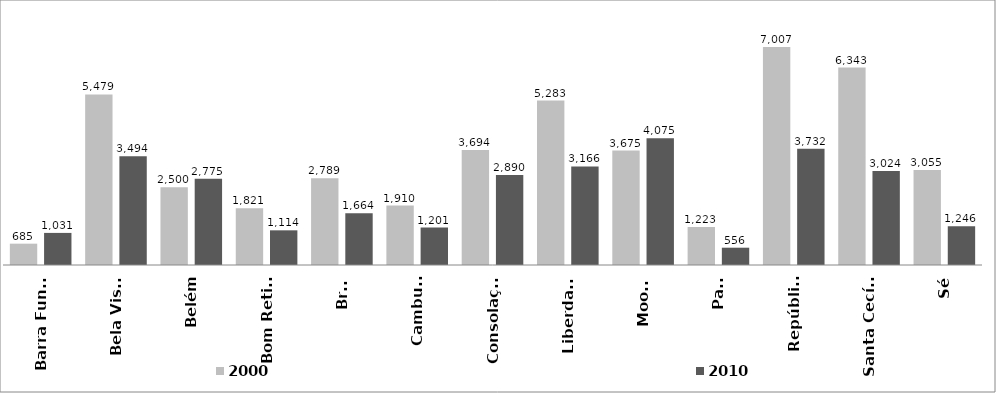
| Category | 2000 | 2010 |
|---|---|---|
| Barra Funda | 685 | 1031 |
| Bela Vista | 5479 | 3494 |
| Belém | 2500 | 2775 |
| Bom Retiro | 1821 | 1114 |
| Brás | 2789 | 1664 |
| Cambuci | 1910 | 1201 |
| Consolação | 3694 | 2890 |
| Liberdade | 5283 | 3166 |
| Mooca | 3675 | 4075 |
| Pari | 1223 | 556 |
| República | 7007 | 3732 |
| Santa Cecília | 6343 | 3024 |
| Sé | 3055 | 1246 |